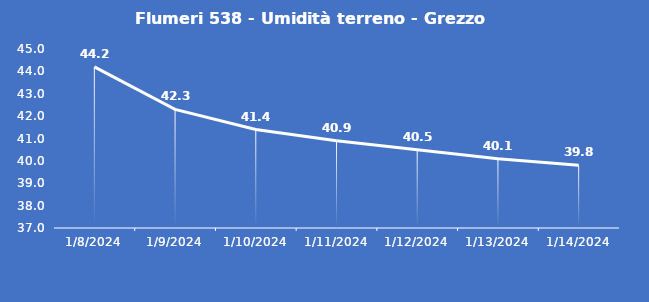
| Category | Flumeri 538 - Umidità terreno - Grezzo (%VWC) |
|---|---|
| 1/8/24 | 44.2 |
| 1/9/24 | 42.3 |
| 1/10/24 | 41.4 |
| 1/11/24 | 40.9 |
| 1/12/24 | 40.5 |
| 1/13/24 | 40.1 |
| 1/14/24 | 39.8 |